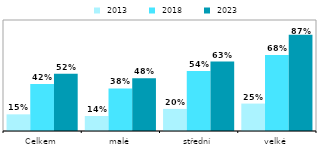
| Category |  2013 |  2018 |  2023 |
|---|---|---|---|
| Celkem | 0.15 | 0.423 | 0.515 |
| malé | 0.135 | 0.384 | 0.475 |
| střední | 0.199 | 0.54 | 0.626 |
| velké | 0.247 | 0.684 | 0.866 |